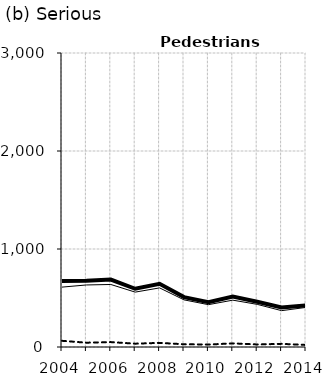
| Category | Built-up | Non built-up | Total |
|---|---|---|---|
| 2004.0 | 611 | 63 | 674 |
| 2005.0 | 633 | 44 | 677 |
| 2006.0 | 638 | 50 | 688 |
| 2007.0 | 560 | 34 | 594 |
| 2008.0 | 603 | 42 | 645 |
| 2009.0 | 481 | 28 | 509 |
| 2010.0 | 432 | 25 | 457 |
| 2011.0 | 478 | 37 | 515 |
| 2012.0 | 435 | 26 | 461 |
| 2013.0 | 371 | 32 | 403 |
| 2014.0 | 404 | 21 | 425 |